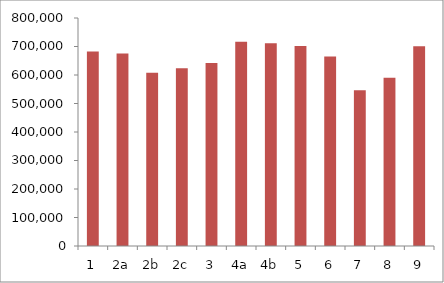
| Category | Silicon |
|---|---|
| 1 | 682674 |
| 2a | 675003 |
| 2b | 607618 |
| 2c | 624056 |
| 3 | 642376 |
| 4a | 716554 |
| 4b | 711176 |
| 5 | 701907 |
| 6 | 664908 |
| 7 | 546499 |
| 8 | 590027 |
| 9 | 700510 |